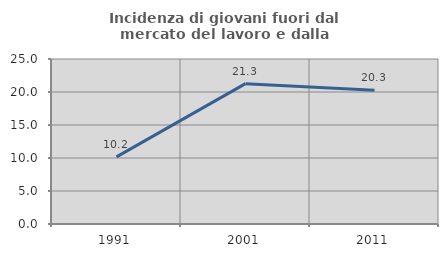
| Category | Incidenza di giovani fuori dal mercato del lavoro e dalla formazione  |
|---|---|
| 1991.0 | 10.164 |
| 2001.0 | 21.267 |
| 2011.0 | 20.276 |